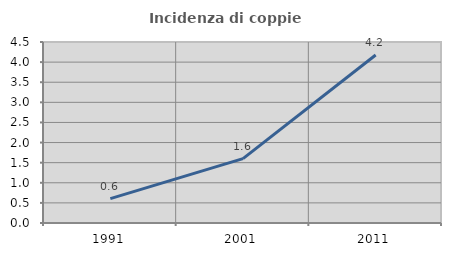
| Category | Incidenza di coppie miste |
|---|---|
| 1991.0 | 0.606 |
| 2001.0 | 1.6 |
| 2011.0 | 4.176 |